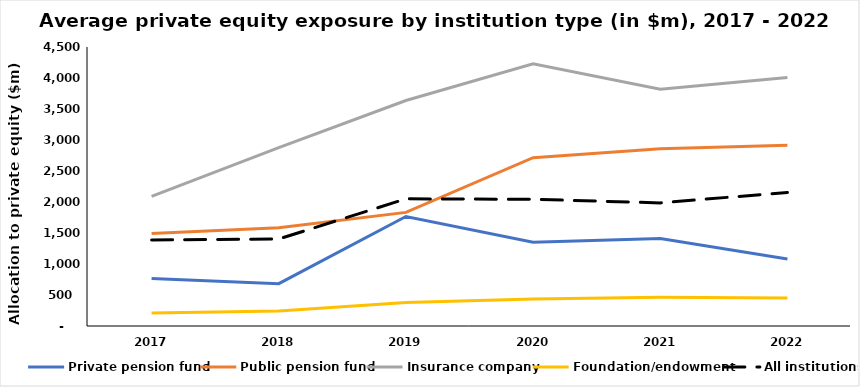
| Category | Private pension fund | Public pension fund | Insurance company | Foundation/endowment | All institutions |
|---|---|---|---|---|---|
| 2017.0 | 764.701 | 1490.336 | 2092.223 | 209.951 | 1387.688 |
| 2018.0 | 683.164 | 1584.989 | 2876.331 | 243.603 | 1403.461 |
| 2019.0 | 1765.516 | 1832.461 | 3637.286 | 378.507 | 2050.725 |
| 2020.0 | 1351.826 | 2714.823 | 4228.858 | 435.559 | 2043.967 |
| 2021.0 | 1411.431 | 2860.175 | 3819.49 | 462.951 | 1985.677 |
| 2022.0 | 1078.989 | 2914.317 | 4007.929 | 451.967 | 2154.803 |